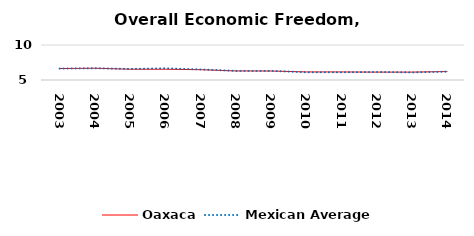
| Category | Oaxaca | Mexican Average  |
|---|---|---|
| 2003.0 | 6.637 | 6.632 |
| 2004.0 | 6.681 | 6.678 |
| 2005.0 | 6.54 | 6.582 |
| 2006.0 | 6.539 | 6.668 |
| 2007.0 | 6.472 | 6.508 |
| 2008.0 | 6.293 | 6.3 |
| 2009.0 | 6.281 | 6.3 |
| 2010.0 | 6.153 | 6.105 |
| 2011.0 | 6.152 | 6.103 |
| 2012.0 | 6.127 | 6.144 |
| 2013.0 | 6.129 | 6.087 |
| 2014.0 | 6.206 | 6.195 |